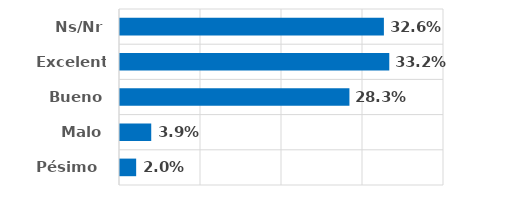
| Category | Series 0 |
|---|---|
| Pésimo  | 0.02 |
| Malo | 0.039 |
| Bueno | 0.283 |
| Excelente | 0.332 |
| Ns/Nr | 0.326 |